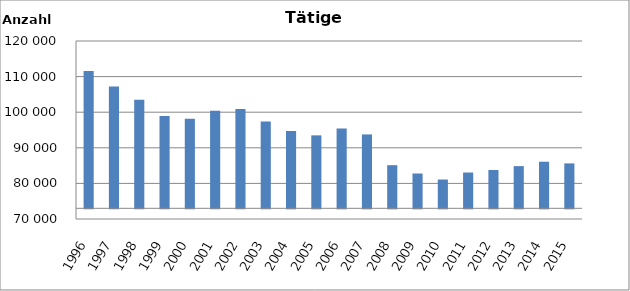
| Category | Series 0 |
|---|---|
| 1996.0 | 111544 |
| 1997.0 | 107253 |
| 1998.0 | 103463 |
| 1999.0 | 98926 |
| 2000.0 | 98154 |
| 2001.0 | 100422 |
| 2002.0 | 100868 |
| 2003.0 | 97367 |
| 2004.0 | 94725 |
| 2005.0 | 93496 |
| 2006.0 | 95427 |
| 2007.0 | 93755 |
| 2008.0 | 85118 |
| 2009.0 | 82782 |
| 2010.0 | 81089 |
| 2011.0 | 83058 |
| 2012.0 | 83766 |
| 2013.0 | 84853 |
| 2014.0 | 86087 |
| 2015.0 | 85622 |